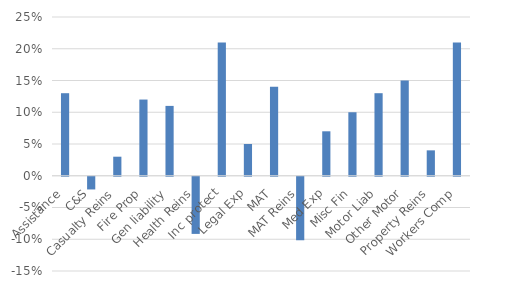
| Category | Series 0 |
|---|---|
| Assistance | 0.13 |
| C&S | -0.02 |
| Casualty Reins | 0.03 |
| Fire Prop | 0.12 |
| Gen liability | 0.11 |
| Health Reins | -0.09 |
| Inc protect | 0.21 |
| Legal Exp | 0.05 |
| MAT | 0.14 |
| MAT Reins | -0.1 |
| Med Exp | 0.07 |
| Misc Fin | 0.1 |
| Motor Liab | 0.13 |
| Other Motor | 0.15 |
| Property Reins | 0.04 |
| Workers Comp | 0.21 |